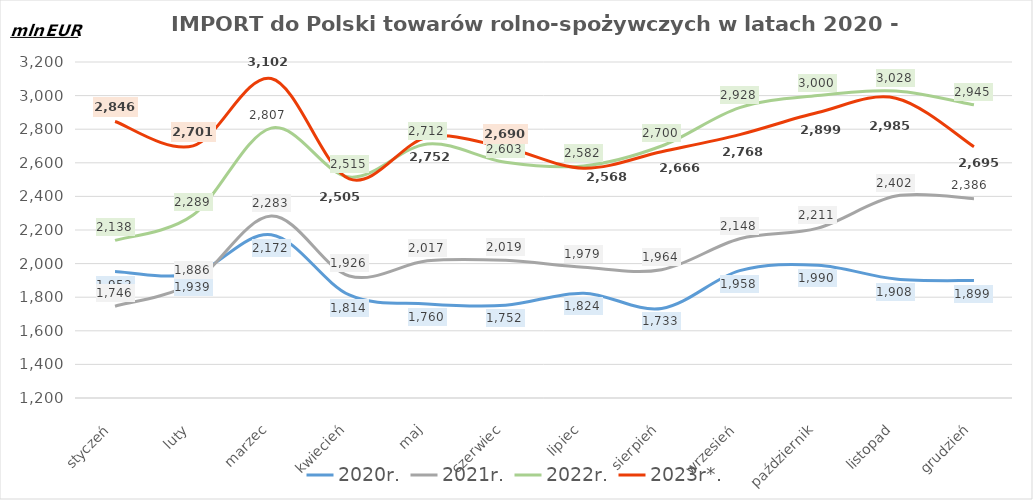
| Category | 2020r. | 2021r. | 2022r. | 2023r*. |
|---|---|---|---|---|
| styczeń | 1952.875 | 1746.472 | 2137.808 | 2845.867 |
| luty | 1939.238 | 1886.399 | 2289.091 | 2700.87 |
| marzec | 2171.859 | 2282.675 | 2806.642 | 3101.675 |
| kwiecień | 1813.505 | 1926.266 | 2514.891 | 2504.561 |
| maj | 1760.244 | 2016.59 | 2712.423 | 2752.061 |
| czerwiec | 1752.308 | 2019.216 | 2603.364 | 2689.694 |
| lipiec | 1824.019 | 1978.508 | 2581.646 | 2568.075 |
| sierpień | 1733.376 | 1963.864 | 2700.066 | 2665.96 |
| wrzesień | 1958.051 | 2148.063 | 2928.412 | 2767.706 |
| październik | 1990.136 | 2211.192 | 3000.315 | 2899.066 |
| listopad | 1908.281 | 2402.132 | 3027.608 | 2984.608 |
| grudzień | 1898.918 | 2385.812 | 2945.108 | 2695.499 |